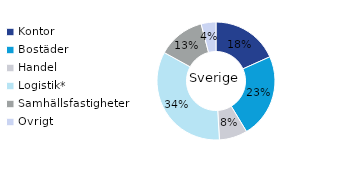
| Category | Sverige |
|---|---|
| Kontor | 0.183 |
| Bostäder | 0.231 |
| Handel | 0.077 |
| Logistik* | 0.339 |
| Samhällsfastigheter | 0.129 |
| Övrigt | 0.04 |